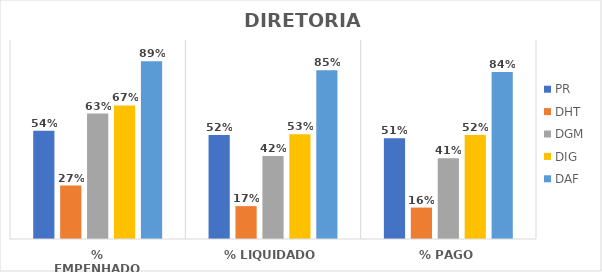
| Category | PR | DHT | DGM | DIG | DAF |
|---|---|---|---|---|---|
| % EMPENHADO | 0.544 | 0.269 | 0.63 | 0.671 | 0.893 |
| % LIQUIDADO | 0.522 | 0.165 | 0.417 | 0.526 | 0.848 |
| % PAGO | 0.506 | 0.158 | 0.406 | 0.522 | 0.839 |